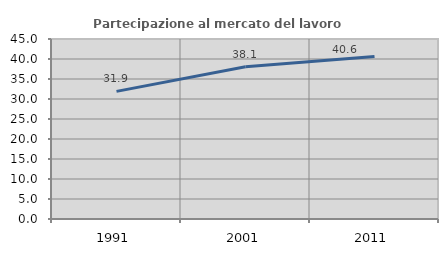
| Category | Partecipazione al mercato del lavoro  femminile |
|---|---|
| 1991.0 | 31.912 |
| 2001.0 | 38.062 |
| 2011.0 | 40.649 |